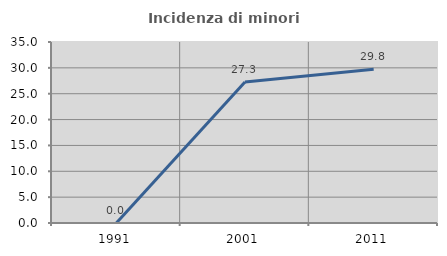
| Category | Incidenza di minori stranieri |
|---|---|
| 1991.0 | 0 |
| 2001.0 | 27.273 |
| 2011.0 | 29.752 |